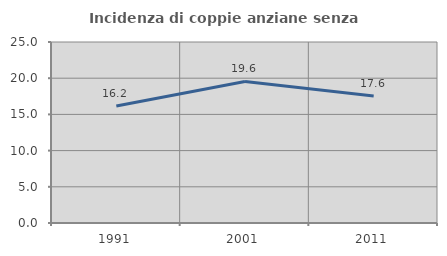
| Category | Incidenza di coppie anziane senza figli  |
|---|---|
| 1991.0 | 16.153 |
| 2001.0 | 19.552 |
| 2011.0 | 17.554 |